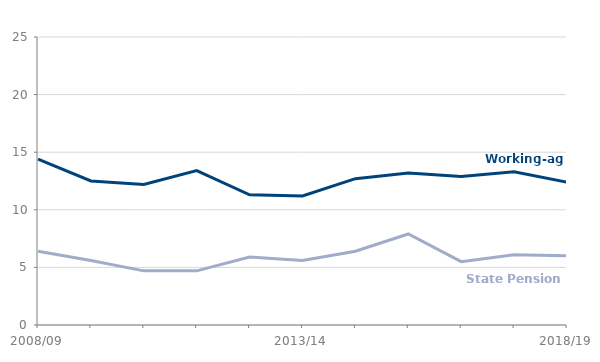
| Category | Working-age | State Pension age |
|---|---|---|
| 2008/09 | 14400 | 6400 |
| 2009/10 | 12500 | 5600 |
| 2010/11 | 12200 | 4700 |
| 2011/12 | 13400 | 4700 |
| 2012/13 | 11300 | 5900 |
| 2013/14 | 11200 | 5600 |
| 2014/15 | 12700 | 6400 |
| 2015/16 | 13200 | 7900 |
| 2016/17 | 12900 | 5500 |
| 2017/18 | 13300 | 6100 |
| 2018/19 | 12400 | 6000 |